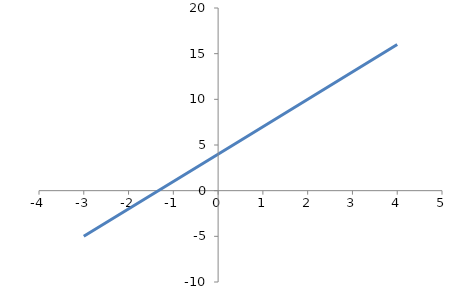
| Category | Series 0 |
|---|---|
| -3.0 | -5 |
| 4.0 | 16 |